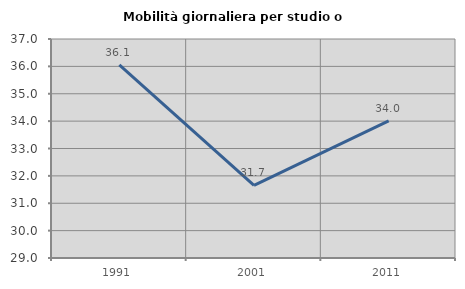
| Category | Mobilità giornaliera per studio o lavoro |
|---|---|
| 1991.0 | 36.056 |
| 2001.0 | 31.656 |
| 2011.0 | 34.011 |